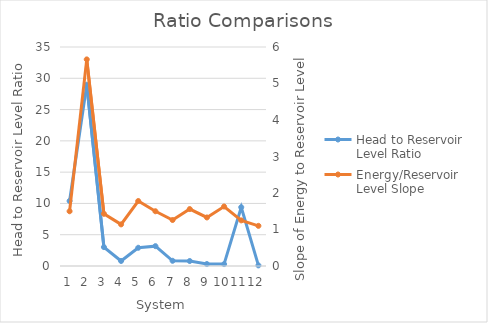
| Category | Head to Reservoir Level Ratio |
|---|---|
| 0 | 10.392 |
| 1 | 28.973 |
| 2 | 3.019 |
| 3 | 0.804 |
| 4 | 2.914 |
| 5 | 3.173 |
| 6 | 0.833 |
| 7 | 0.794 |
| 8 | 0.312 |
| 9 | 0.302 |
| 10 | 9.393 |
| 11 | 0.095 |